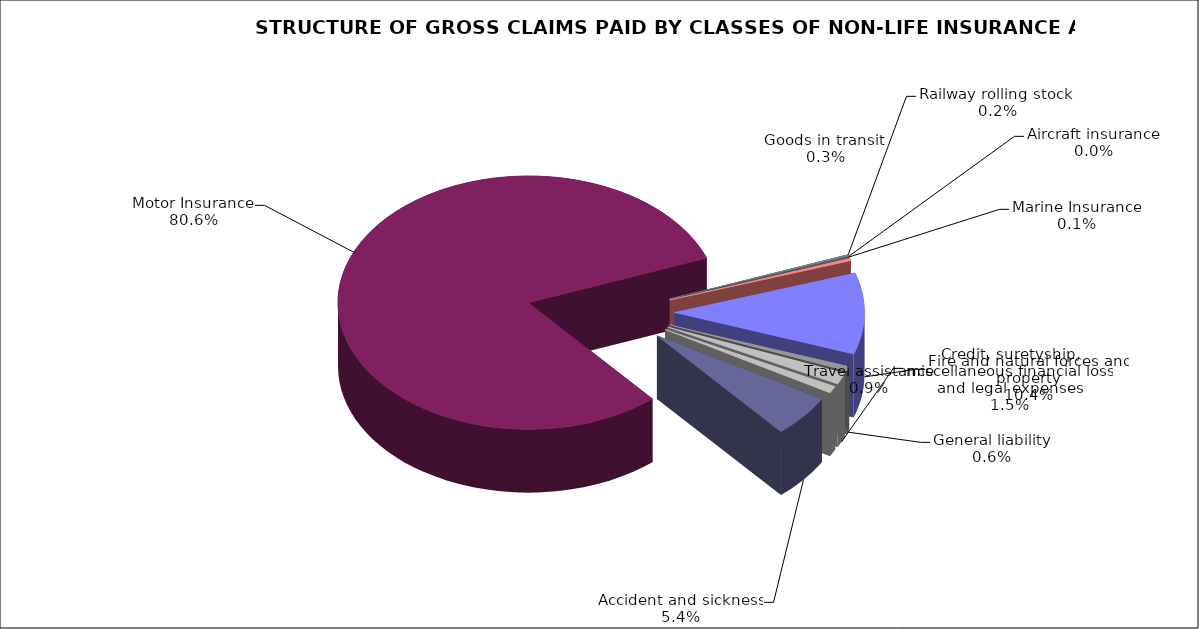
| Category | Series 0 |
|---|---|
| Accident and sickness | 0.054 |
| Motor Insurance | 0.806 |
| Railway rolling stock  | 0.002 |
| Aircraft insurance | 0 |
| Marine Insurance | 0.001 |
| Goods in transit  | 0.003 |
| Fire and natural forces and property | 0.104 |
| General liability | 0.006 |
| Credit, suretyship, miscellaneous financial loss and legal expenses | 0.015 |
| Travel assistance | 0.009 |